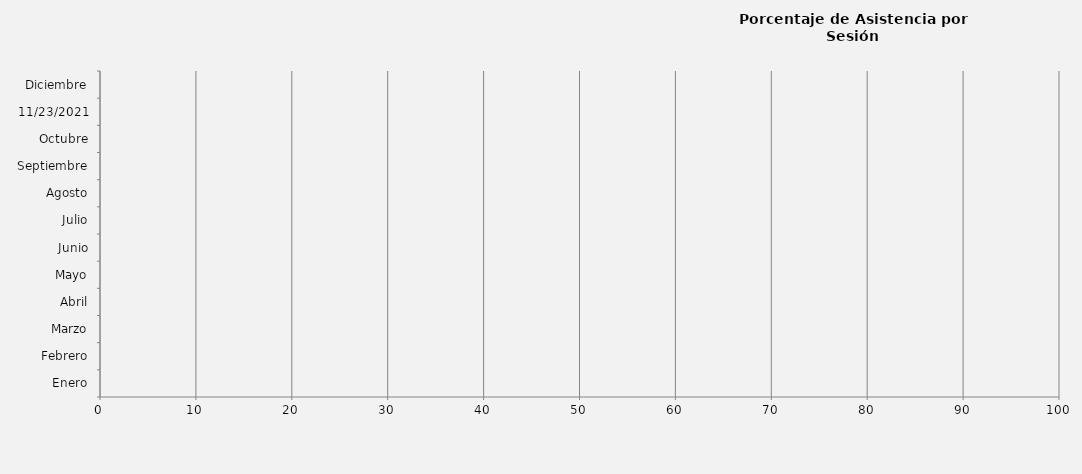
| Category | Series 0 |
|---|---|
| Enero | 0 |
| Febrero | 0 |
| Marzo | 0 |
| Abril | 0 |
| Mayo | 0 |
| Junio | 0 |
| Julio | 0 |
| Agosto | 0 |
| Septiembre | 0 |
| Octubre | 0 |
| 23/11/2021 | 0 |
| Diciembre | 0 |